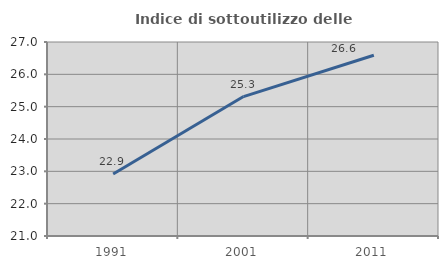
| Category | Indice di sottoutilizzo delle abitazioni  |
|---|---|
| 1991.0 | 22.917 |
| 2001.0 | 25.312 |
| 2011.0 | 26.59 |